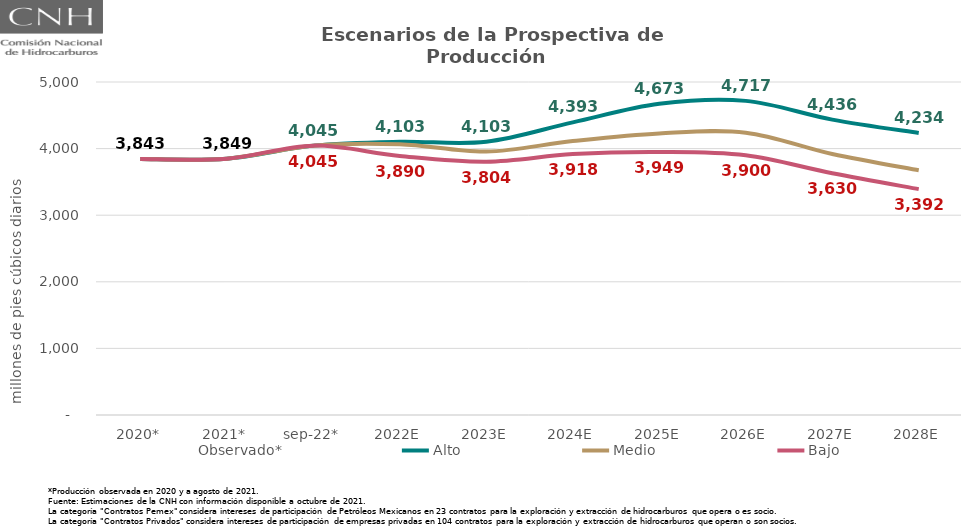
| Category | Observado* | Alto | Medio | Bajo |
|---|---|---|---|---|
| 2020* | 3843.295 | 3843.295 | 3843.295 | 3843.295 |
| 2021* | 3849.174 | 3849.174 | 3849.174 | 3849.174 |
| sep-22* | 4044.539 | 4044.539 | 4044.539 | 4044.539 |
| 2022E | 4065.509 | 4103.257 | 4065.509 | 3890.001 |
| 2023E | 3956.237 | 4102.985 | 3956.237 | 3804.235 |
| 2024E | 4113.094 | 4393.187 | 4113.094 | 3917.733 |
| 2025E | 4227.383 | 4672.576 | 4227.383 | 3949.45 |
| 2026E | 4238.731 | 4716.644 | 4238.731 | 3899.858 |
| 2027E | 3918.633 | 4435.521 | 3918.633 | 3629.832 |
| 2028E | 3674.987 | 4234.399 | 3674.987 | 3391.873 |